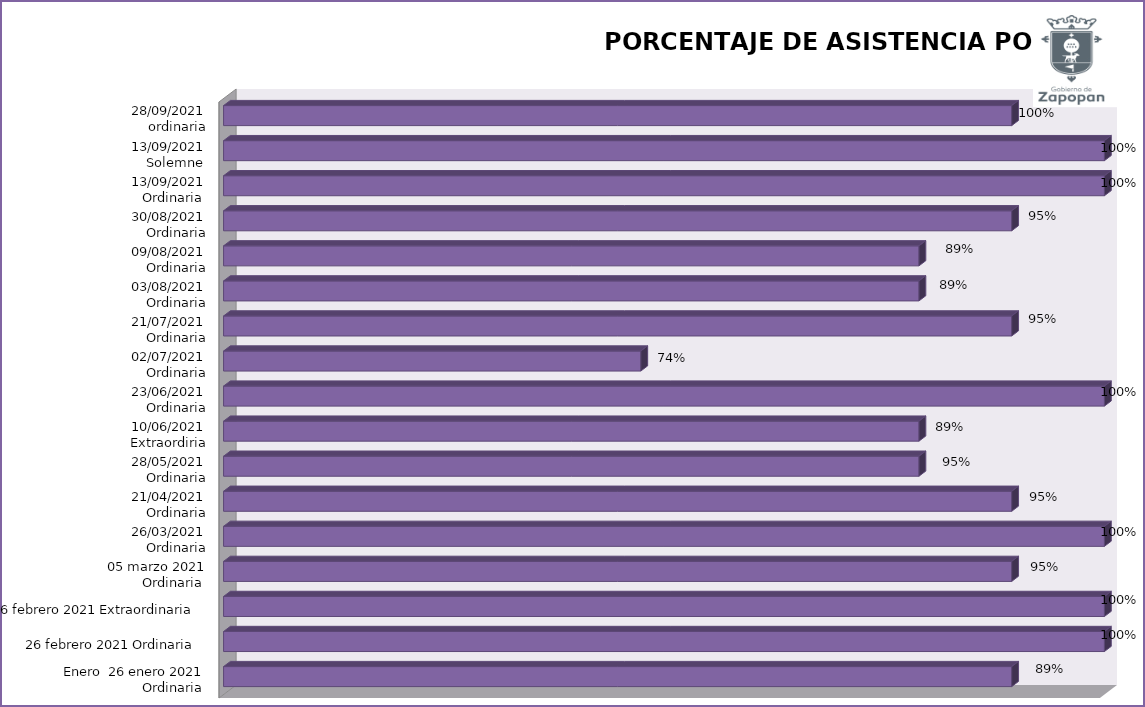
| Category | Series 0 |
|---|---|
| Enero  26 enero 2021
Ordinaria  | 94.737 |
|  26 febrero 2021 Ordinaria  | 100 |
| 26 febrero 2021 Extraordinaria  | 100 |
| 05 marzo 2021
Ordinaria  | 94.737 |
| 26/03/2021
Ordinaria | 100 |
| 21/04/2021
Ordinaria | 94.737 |
| 28/05/2021
Ordinaria | 89.474 |
| 10/06/2021
Extraordiria | 89.474 |
| 23/06/2021
Ordinaria | 100 |
| 02/07/2021
Ordinaria | 73.684 |
| 21/07/2021
Ordinaria | 94.737 |
| 03/08/2021
Ordinaria | 89.474 |
| 09/08/2021
Ordinaria | 89.474 |
| 30/08/2021
Ordinaria | 94.737 |
| 13/09/2021
Ordinaria  | 100 |
| 13/09/2021
Solemne  | 100 |
| 28/09/2021
ordinaria | 94.737 |